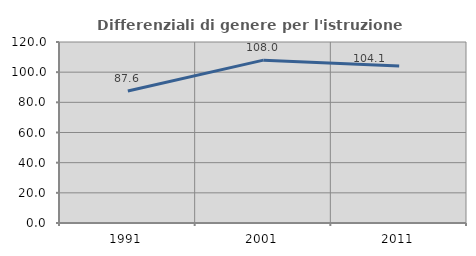
| Category | Differenziali di genere per l'istruzione superiore |
|---|---|
| 1991.0 | 87.552 |
| 2001.0 | 107.96 |
| 2011.0 | 104.114 |